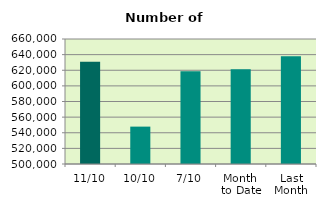
| Category | Series 0 |
|---|---|
| 11/10 | 631012 |
| 10/10 | 547848 |
| 7/10 | 618600 |
| Month 
to Date | 621432.857 |
| Last
Month | 637968.273 |